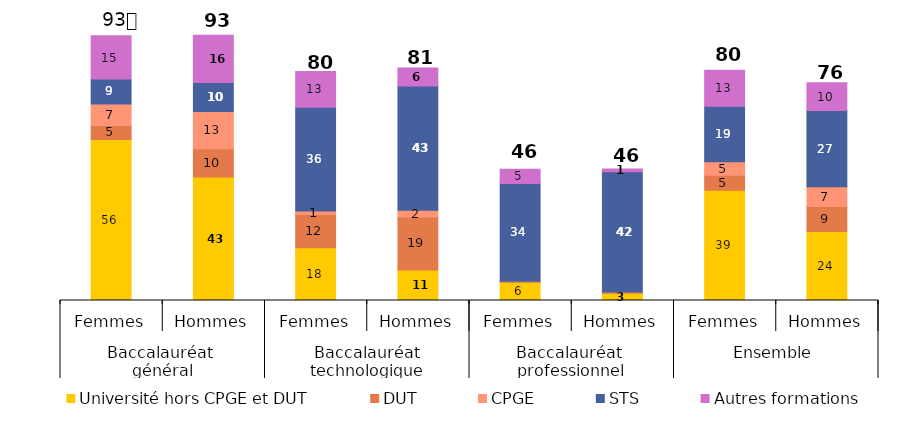
| Category | Université hors CPGE et DUT | DUT | CPGE | STS | Autres formations |
|---|---|---|---|---|---|
| 0 | 56.324 | 4.892 | 7.499 | 8.731 | 15.13 |
| 1 | 43.177 | 9.902 | 13.02 | 10.168 | 16.475 |
| 2 | 18.45 | 11.659 | 1.202 | 36.225 | 12.518 |
| 3 | 10.676 | 18.515 | 2.404 | 43.433 | 6.244 |
| 4 | 6.348 | 0.319 | 0.036 | 34.184 | 5.007 |
| 5 | 2.55 | 0.379 | 0.077 | 41.985 | 0.948 |
| 6 | 38.548 | 5.24 | 4.721 | 19.368 | 12.594 |
| 7 | 24.122 | 8.73 | 6.896 | 26.676 | 9.728 |